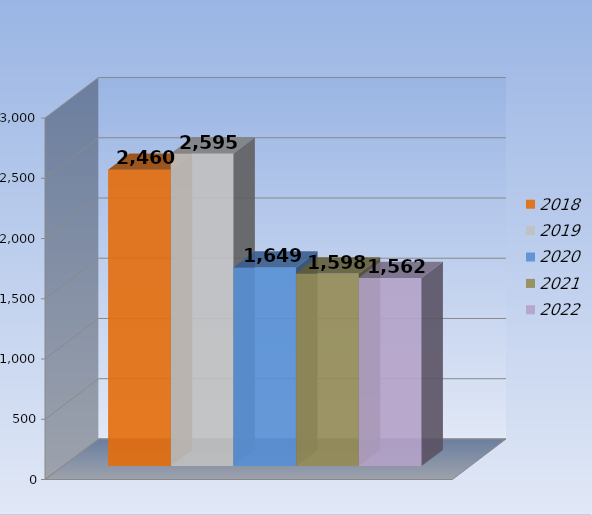
| Category | 2018 | 2019 | 2020 | 2021 | 2022 |
|---|---|---|---|---|---|
| 0 | 2460 | 2595 | 1649 | 1598 | 1562 |